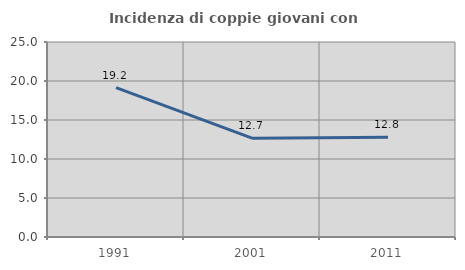
| Category | Incidenza di coppie giovani con figli |
|---|---|
| 1991.0 | 19.156 |
| 2001.0 | 12.668 |
| 2011.0 | 12.774 |